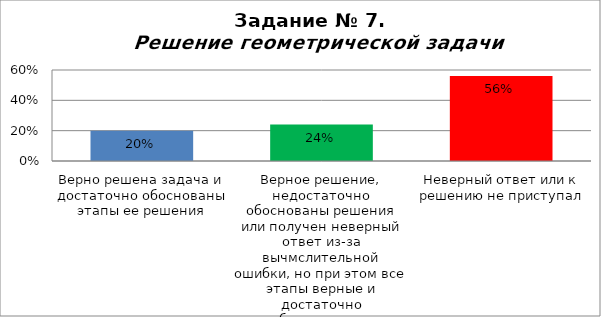
| Category | Решение геометрической задачи  |
|---|---|
| Верно решена задача и достаточно обоснованы этапы ее решения | 0.2 |
| Верное решение, недостаточно обоснованы решения или получен неверный ответ из-за вычмслительной ошибки, но при этом все этапы верные и достаточно обоснованные | 0.24 |
| Неверный ответ или к решению не приступал | 0.56 |